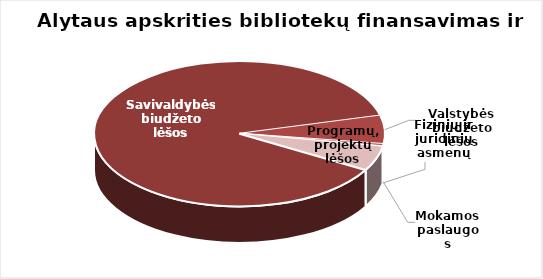
| Category | Series 0 |
|---|---|
| Savivaldybės biudžeto lėšos | 2255172.62 |
| Valstybės biudžeto lėšos | 162584.38 |
| Mokamos paslaugos | 11633.72 |
| Fizinių ir juridinių asmenų parama | 3804.66 |
| Programų, projektų lėšos | 140300.58 |